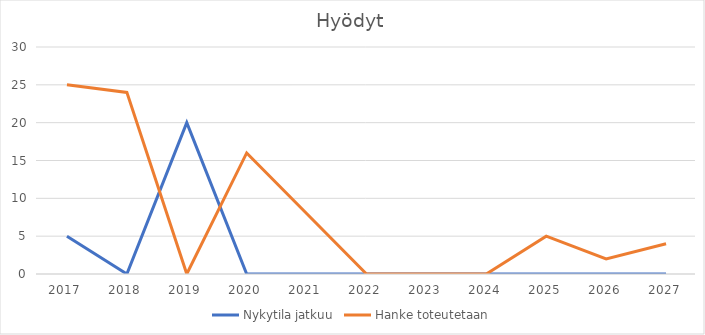
| Category | Nykytila jatkuu | Hanke toteutetaan |
|---|---|---|
| 2017.0 | 5 | 25 |
| 2018.0 | 0 | 24 |
| 2019.0 | 20 | 0 |
| 2020.0 | 0 | 16 |
| 2021.0 | 0 | 8 |
| 2022.0 | 0 | 0 |
| 2023.0 | 0 | 0 |
| 2024.0 | 0 | 0 |
| 2025.0 | 0 | 5 |
| 2026.0 | 0 | 2 |
| 2027.0 | 0 | 4 |